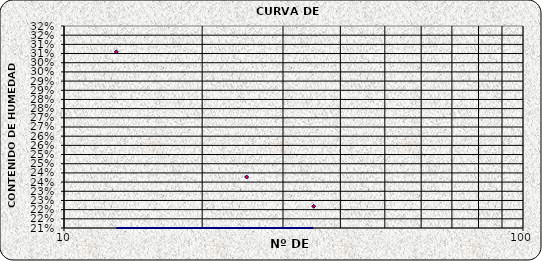
| Category | Series 0 |
|---|---|
| 35.0 | 0.222 |
| 25.0 | 0.238 |
| 13.0 | 0.306 |